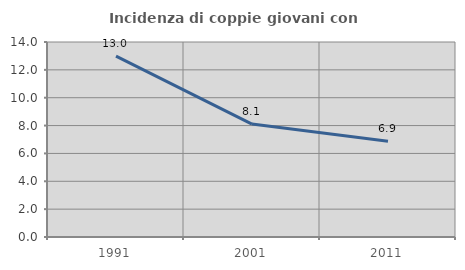
| Category | Incidenza di coppie giovani con figli |
|---|---|
| 1991.0 | 12.982 |
| 2001.0 | 8.108 |
| 2011.0 | 6.87 |